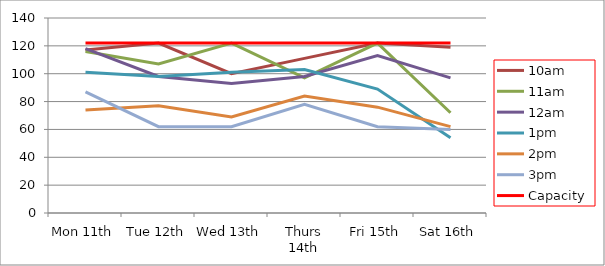
| Category | 9am | 10am | 11am | 12am | 1pm | 2pm | 3pm | 4pm | 5pm | Capacity |
|---|---|---|---|---|---|---|---|---|---|---|
| Mon 11th |  | 117 | 116 | 118 | 101 | 74 | 87 |  |  | 122 |
| Tue 12th |  | 122 | 107 | 98 | 98 | 77 | 62 |  |  | 122 |
| Wed 13th |  | 100 | 122 | 93 | 101 | 69 | 62 |  |  | 122 |
| Thurs 14th |  | 111 | 97 | 98 | 103 | 84 | 78 |  |  | 122 |
| Fri 15th |  | 122 | 122 | 113 | 89 | 76 | 62 |  |  | 122 |
| Sat 16th |  | 119 | 72 | 97 | 54 | 62 | 60 |  |  | 122 |